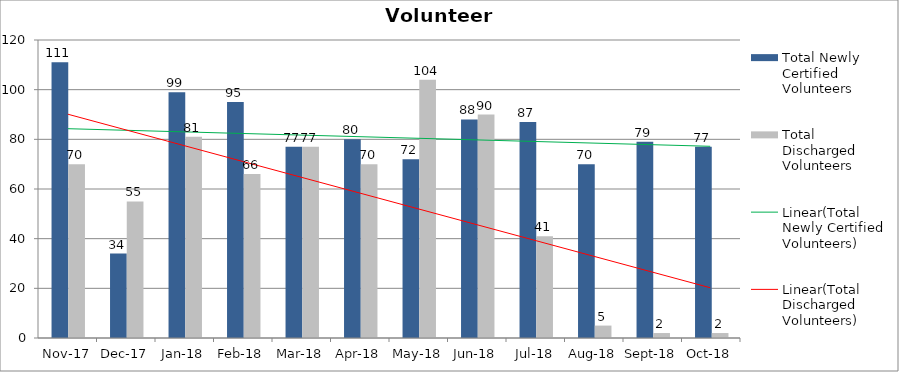
| Category | Total Newly Certified Volunteers | Total Discharged Volunteers |
|---|---|---|
| 2017-11-01 | 111 | 70 |
| 2017-12-01 | 34 | 55 |
| 2018-01-01 | 99 | 81 |
| 2018-02-01 | 95 | 66 |
| 2018-03-01 | 77 | 77 |
| 2018-04-01 | 80 | 70 |
| 2018-05-01 | 72 | 104 |
| 2018-06-01 | 88 | 90 |
| 2018-07-01 | 87 | 41 |
| 2018-08-01 | 70 | 5 |
| 2018-09-01 | 79 | 2 |
| 2018-10-01 | 77 | 2 |